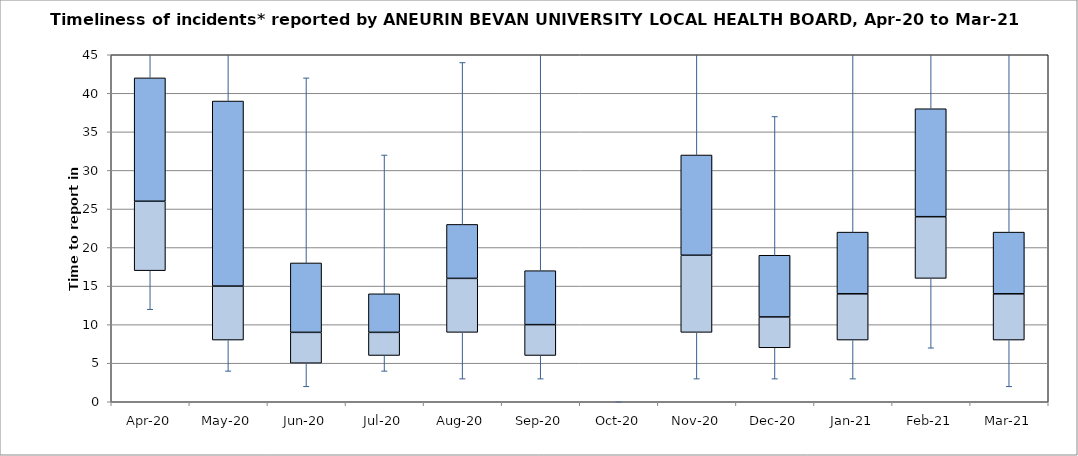
| Category | Series 0 | Series 1 | Series 2 |
|---|---|---|---|
| Apr-20 | 17 | 9 | 16 |
| May-20 | 8 | 7 | 24 |
| Jun-20 | 5 | 4 | 9 |
| Jul-20 | 6 | 3 | 5 |
| Aug-20 | 9 | 7 | 7 |
| Sep-20 | 6 | 4 | 7 |
| Oct-20 | 0 | 0 | 0 |
| Nov-20 | 9 | 10 | 13 |
| Dec-20 | 7 | 4 | 8 |
| Jan-21 | 8 | 6 | 8 |
| Feb-21 | 16 | 8 | 14 |
| Mar-21 | 8 | 6 | 8 |